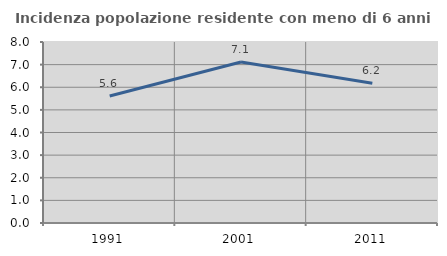
| Category | Incidenza popolazione residente con meno di 6 anni |
|---|---|
| 1991.0 | 5.613 |
| 2001.0 | 7.118 |
| 2011.0 | 6.179 |